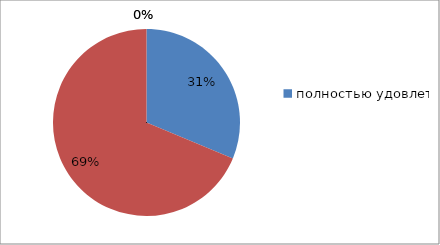
| Category | Series 0 | Series 1 |
|---|---|---|
| полностью удовлетворены | 31.3 | 31.3 |
| частично удовлетворены | 68.8 | 68.8 |
| не удовлетворены | 0 | 0 |